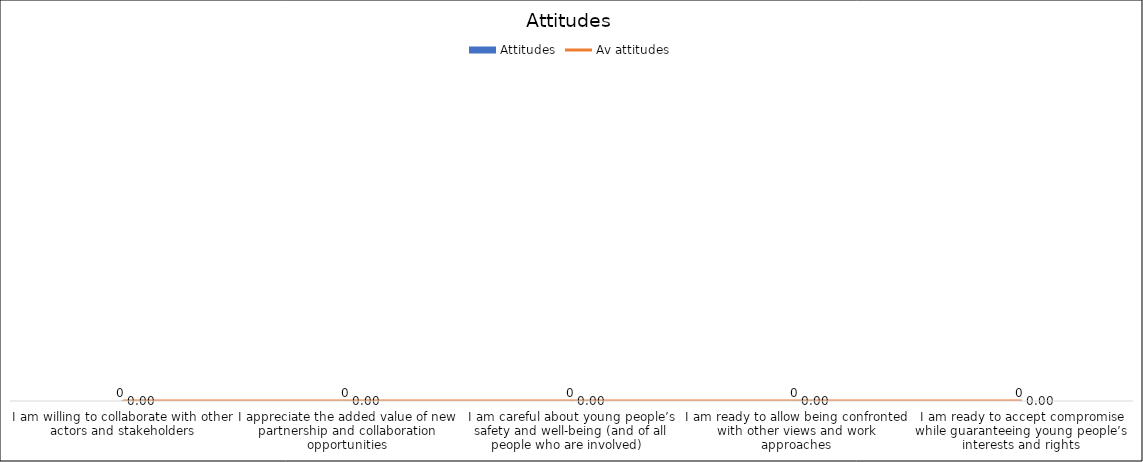
| Category | Attitudes |
|---|---|
| I am willing to collaborate with other actors and stakeholders | 0 |
| I appreciate the added value of new partnership and collaboration opportunities | 0 |
| I am careful about young people’s safety and well-being (and of all people who are involved)   | 0 |
| I am ready to allow being confronted with other views and work approaches | 0 |
| I am ready to accept compromise while guaranteeing young people’s interests and rights | 0 |